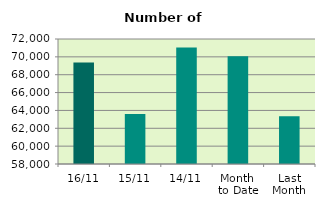
| Category | Series 0 |
|---|---|
| 16/11 | 69364 |
| 15/11 | 63596 |
| 14/11 | 71056 |
| Month 
to Date | 70080.333 |
| Last
Month | 63348.667 |